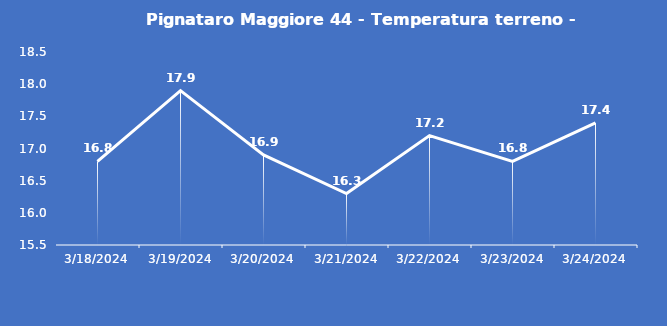
| Category | Pignataro Maggiore 44 - Temperatura terreno - Grezzo (°C) |
|---|---|
| 3/18/24 | 16.8 |
| 3/19/24 | 17.9 |
| 3/20/24 | 16.9 |
| 3/21/24 | 16.3 |
| 3/22/24 | 17.2 |
| 3/23/24 | 16.8 |
| 3/24/24 | 17.4 |